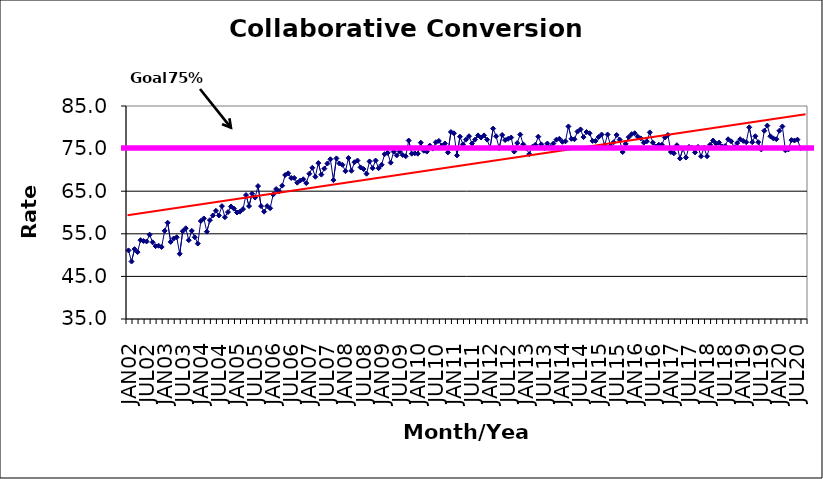
| Category | Series 0 |
|---|---|
| JAN02 | 51.1 |
| FEB02 | 48.5 |
| MAR02 | 51.4 |
| APR02 | 50.7 |
| MAY02 | 53.5 |
| JUN02 | 53.3 |
| JUL02 | 53.2 |
| AUG02 | 54.8 |
| SEP02 | 53 |
| OCT02 | 52.1 |
| NOV02 | 52.2 |
| DEC02 | 51.9 |
| JAN03 | 55.7 |
| FEB03 | 57.6 |
| MAR03 | 53.1 |
| APR03 | 53.9 |
| MAY03 | 54.2 |
| JUN03 | 50.3 |
| JUL03 | 55.6 |
| AUG03 | 56.3 |
| SEP03 | 53.5 |
| OCT03 | 55.7 |
| NOV03 | 54.2 |
| DEC03 | 52.7 |
| JAN04 | 58 |
| FEB04 | 58.6 |
| MAR04 | 55.5 |
| APR04 | 58.2 |
| MAY04 | 59.3 |
| JUN04 | 60.4 |
| JUL04 | 59.3 |
| AUG04 | 61.5 |
| SEP04 | 58.9 |
| OCT04 | 60.1 |
| NOV04 | 61.4 |
| DEC04 | 60.9 |
| JAN05 | 60 |
| FEB05 | 60.2 |
| MAR05 | 60.8 |
| APR05 | 64.1 |
| MAY05 | 61.5 |
| JUN05 | 64.4 |
| JUL05 | 63.5 |
| AUG05 | 66.2 |
| SEP05 | 61.5 |
| OCT05 | 60.2 |
| NOV05 | 61.5 |
| DEC05 | 61 |
| JAN06 | 64.2 |
| FEB06 | 65.5 |
| MAR06 | 65 |
| APR06 | 66.3 |
| MAY06 | 68.8 |
| JUN06 | 69.2 |
| JUL06 | 68.1 |
| AUG06 | 68.1 |
| SEP06 | 67 |
| OCT06 | 67.5 |
| NOV06 | 67.8 |
| DEC06 | 66.9 |
| JAN07 | 69.1 |
| FEB07 | 70.5 |
| MAR07 | 68.4 |
| APR07 | 71.6 |
| MAY07 | 68.9 |
| JUN07 | 70.3 |
| JUL07 | 71.5 |
| AUG07 | 72.5 |
| SEP07 | 67.6 |
| OCT07 | 72.7 |
| NOV07 | 71.5 |
| DEC07 | 71.2 |
| JAN08 | 69.7 |
| FEB08 | 72.8 |
| MAR08 | 69.8 |
| APR08 | 71.8 |
| MAY08 | 72.2 |
| JUN08 | 70.6 |
| JUL08 | 70.2 |
| AUG08 | 69.1 |
| SEP08 | 72 |
| OCT08 | 70.4 |
| NOV08 | 72.2 |
| DEC08 | 70.4 |
| JAN09 | 71.2 |
| FEB09 | 73.7 |
| MAR09 | 74 |
| APR09 | 71.7 |
| MAY09 | 74.3 |
| JUN09 | 73.4 |
| JUL09 | 74.3 |
| AUG09 | 73.5 |
| SEP09 | 73.2 |
| OCT09 | 76.9 |
| NOV09 | 73.8 |
| DEC09 | 73.9 |
| JAN10 | 73.8 |
| FEB10 | 76.4 |
| MAR10 | 74.5 |
| APR10 | 74.3 |
| MAY10 | 75.7 |
| JUN10 | 75 |
| JUL10 | 76.5 |
| AUG10 | 76.8 |
| SEP10 | 75.7 |
| OCT10 | 76.2 |
| NOV10 | 74.1 |
| DEC10 | 78.9 |
| JAN11 | 78.6 |
| FEB11 | 73.4 |
| MAR11 | 77.8 |
| APR11 | 76 |
| MAY11 | 77.1 |
| JUN11 | 77.9 |
| JUL11 | 76.2 |
| AUG11 | 77.1 |
| SEP11 | 78.1 |
| OCT11 | 77.6 |
| NOV11 | 78.1 |
| DEC11 | 77.1 |
| JAN12 | 75.2 |
| FEB12 | 79.7 |
| MAR12 | 77.9 |
| APR12 | 75.1 |
| MAY12 | 78.2 |
| JUN12 | 77 |
| JUL12 | 77.3 |
| AUG12 | 77.6 |
| SEP12 | 74.3 |
| OCT12 | 76.3 |
| NOV12 | 78.3 |
| DEC12 | 76 |
| JAN13 | 75.1 |
| FEB13 | 73.7 |
| MAR13 | 75.4 |
| APR13 | 75.9 |
| MAY13 | 77.8 |
| JUN13 | 76 |
| JUL13 | 75.1 |
| AUG13 | 76.2 |
| SEP13 | 75.4 |
| OCT13 | 76.2 |
| NOV13 | 77.1 |
| DEC13 | 77.3 |
| JAN14 | 76.6 |
| FEB14 | 76.7 |
| MAR14 | 80.2 |
| APR14 | 77.3 |
| MAY14 | 77.2 |
| JUN14 | 79 |
| JUL14 | 79.5 |
| AUG14 | 77.7 |
| SEP14 | 78.9 |
| OCT14 | 78.6 |
| NOV14 | 76.8 |
| DEC14 | 76.8 |
| JAN15 | 77.7 |
| FEB15 | 78.3 |
| MAR15 | 75.8 |
| APR15 | 78.3 |
| MAY15 | 75.6 |
| JUN15 | 76.5 |
| JUL15 | 78.2 |
| AUG15 | 77.1 |
| SEP15 | 74.2 |
| OCT15 | 76.1 |
| NOV15 | 77.7 |
| DEC15 | 78.4 |
| JAN16 | 78.6 |
| FEB16 | 77.8 |
| MAR16 | 77.4 |
| APR16 | 76.4 |
| MAY16 | 76.7 |
| JUN16 | 78.8 |
| JUL16 | 76.4 |
| AUG16 | 75.5 |
| SEP16 | 75.9 |
| OCT16 | 75.9 |
| NOV16 | 77.6 |
| DEC16 | 78.2 |
| JAN17 | 74.2 |
| FEB17 | 73.9 |
| MAR17 | 75.8 |
| APR17 | 72.7 |
| MAY17 | 75 |
| JUN17 | 72.9 |
| JUL17 | 75.4 |
| AUG17 | 75.2 |
| SEP17 | 74.1 |
| OCT17 | 75.4 |
| NOV17 | 73.2 |
| DEC17 | 75.2 |
| JAN18 | 73.2 |
| FEB18 | 75.9 |
| MAR18 | 76.9 |
| APR18 | 76.2 |
| MAY18 | 76.4 |
| JUN18 | 75.5 |
| JUL18 | 75.6 |
| AUG18 | 77.2 |
| SEP18 | 76.7 |
| OCT18 | 75.3 |
| NOV18 | 76.3 |
| DEC18 | 77.2 |
| JAN19 | 76.8 |
| FEB19 | 76.5 |
| MAR19 | 80 |
| APR19 | 76.5 |
| MAY19 | 77.9 |
| JUN19 | 76.5 |
| JUL19 | 74.8 |
| AUG19 | 79.2 |
| SEP19 | 80.4 |
| OCT19 | 77.9 |
| NOV19 | 77.4 |
| DEC19 | 77.2 |
| JAN20 | 79.2 |
| FEB20 | 80.2 |
| MAR20 | 74.6 |
| APR20 | 74.8 |
| MAY20 | 77 |
| JUN20 | 76.9 |
| JUL20 | 77.1 |
| AUG20 | 75.1 |